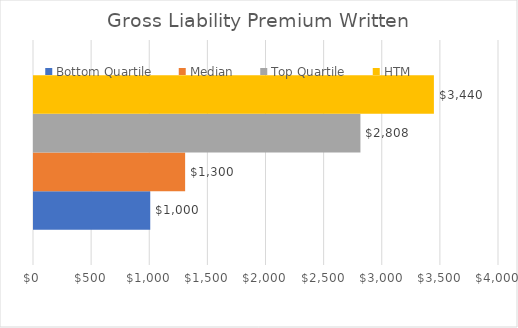
| Category | Bottom Quartile | Median | Top Quartile | HTM  |
|---|---|---|---|---|
| 0 | 1000 | 1300 | 2808 | 3440 |